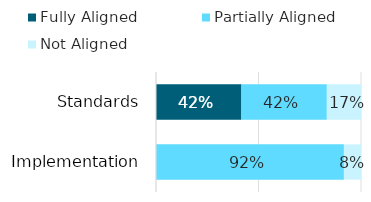
| Category | Fully Aligned | Partially Aligned | Not Aligned |
|---|---|---|---|
| Standards | 0.417 | 0.417 | 0.167 |
| Implementation | 0 | 0.917 | 0.083 |